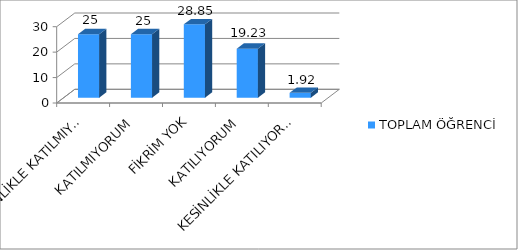
| Category | TOPLAM ÖĞRENCİ |
|---|---|
| KESİNLİKLE KATILMIYORUM | 25 |
| KATILMIYORUM | 25 |
| FİKRİM YOK | 28.85 |
| KATILIYORUM | 19.23 |
| KESİNLİKLE KATILIYORUM | 1.92 |